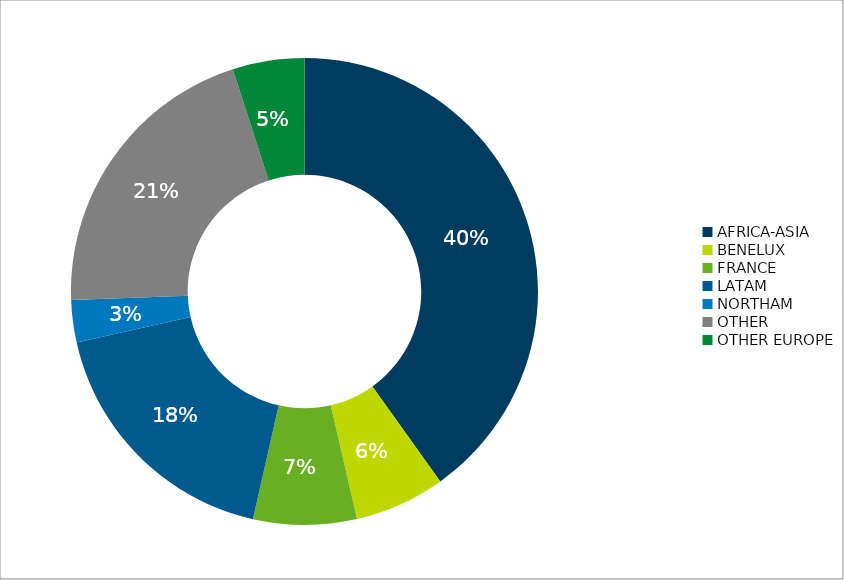
| Category | Total |
|---|---|
| AFRICA-ASIA | 43646.934 |
| BENELUX | 6823.337 |
| FRANCE | 7784.931 |
| LATAM | 19522.007 |
| NORTHAM | 3185.494 |
| OTHER | 22427.849 |
| OTHER EUROPE | 5402.963 |